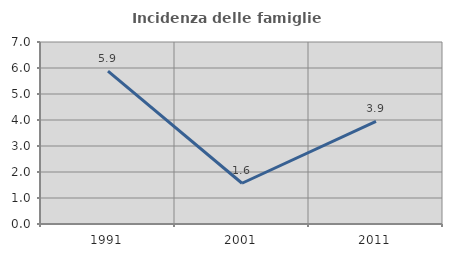
| Category | Incidenza delle famiglie numerose |
|---|---|
| 1991.0 | 5.882 |
| 2001.0 | 1.567 |
| 2011.0 | 3.944 |